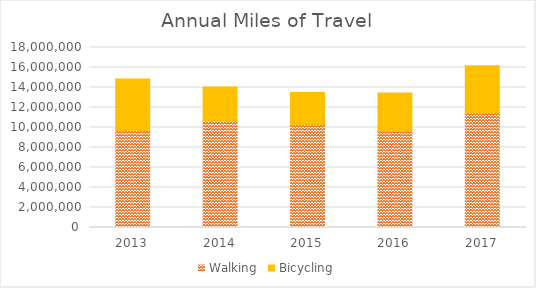
| Category | Walking | Bicycling |
|---|---|---|
| 2013 | 9673260.736 | 5169089.11 |
| 2014 | 10654860.216 | 3401064.927 |
| 2015 | 10268474.658 | 3238475.585 |
| 2016 | 9628467.059 | 3828781.827 |
| 2017 | 11460318.037 | 4719403.338 |